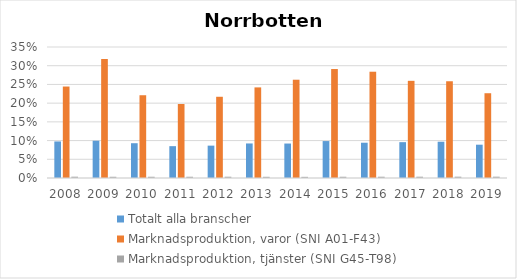
| Category | Totalt alla branscher | Marknadsproduktion, varor (SNI A01-F43) | Marknadsproduktion, tjänster (SNI G45-T98) |
|---|---|---|---|
| 2008 | 0.098 | 0.244 | 0.003 |
| 2009 | 0.1 | 0.318 | 0.003 |
| 2010 | 0.093 | 0.221 | 0.003 |
| 2011 | 0.085 | 0.198 | 0.003 |
| 2012 | 0.086 | 0.217 | 0.003 |
| 2013 | 0.092 | 0.242 | 0.003 |
| 2014 | 0.092 | 0.263 | 0.003 |
| 2015 | 0.099 | 0.291 | 0.003 |
| 2016 | 0.094 | 0.284 | 0.003 |
| 2017 | 0.096 | 0.26 | 0.003 |
| 2018 | 0.097 | 0.258 | 0.004 |
| 2019 | 0.089 | 0.226 | 0.004 |